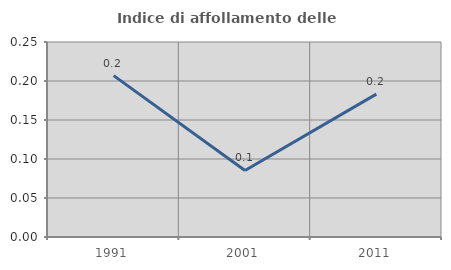
| Category | Indice di affollamento delle abitazioni  |
|---|---|
| 1991.0 | 0.207 |
| 2001.0 | 0.085 |
| 2011.0 | 0.183 |